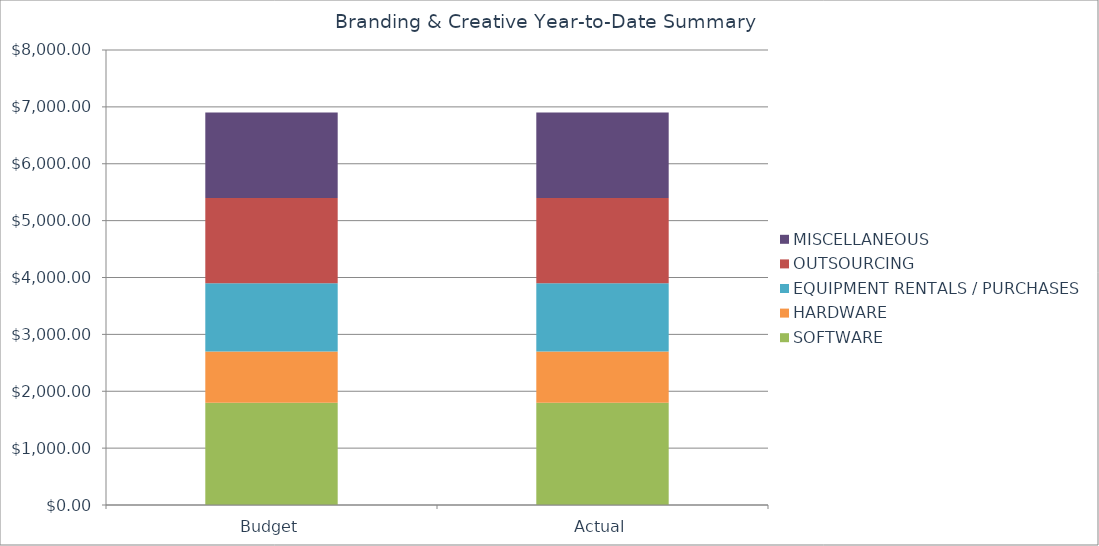
| Category | SOFTWARE | HARDWARE | EQUIPMENT RENTALS / PURCHASES | OUTSOURCING | MISCELLANEOUS |
|---|---|---|---|---|---|
| Budget | 1800 | 900 | 1200 | 1500 | 1500 |
| Actual | 1800 | 900 | 1200 | 1500 | 1500 |